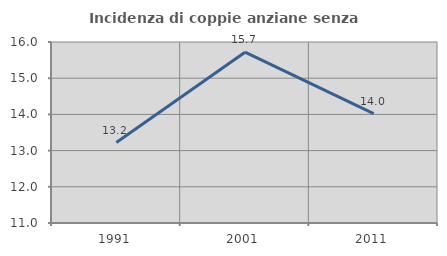
| Category | Incidenza di coppie anziane senza figli  |
|---|---|
| 1991.0 | 13.223 |
| 2001.0 | 15.719 |
| 2011.0 | 14.019 |